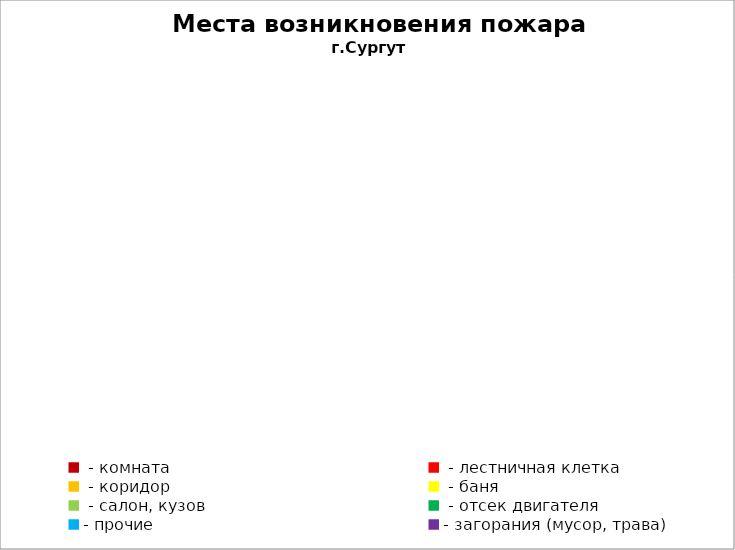
| Category | Места возникновения пожара |
|---|---|
|  - комната | 60 |
|  - лестничная клетка | 8 |
|  - коридор | 5 |
|  - баня | 29 |
|  - салон, кузов | 12 |
|  - отсек двигателя | 35 |
| - прочие | 101 |
| - загорания (мусор, трава)  | 40 |